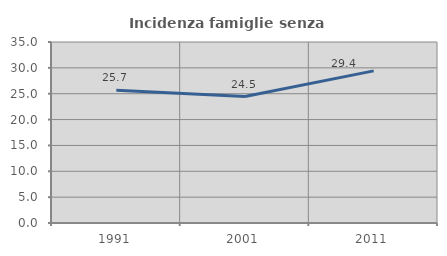
| Category | Incidenza famiglie senza nuclei |
|---|---|
| 1991.0 | 25.651 |
| 2001.0 | 24.453 |
| 2011.0 | 29.412 |